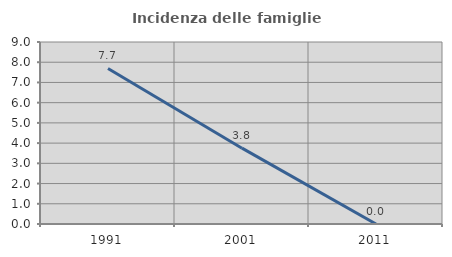
| Category | Incidenza delle famiglie numerose |
|---|---|
| 1991.0 | 7.692 |
| 2001.0 | 3.75 |
| 2011.0 | 0 |